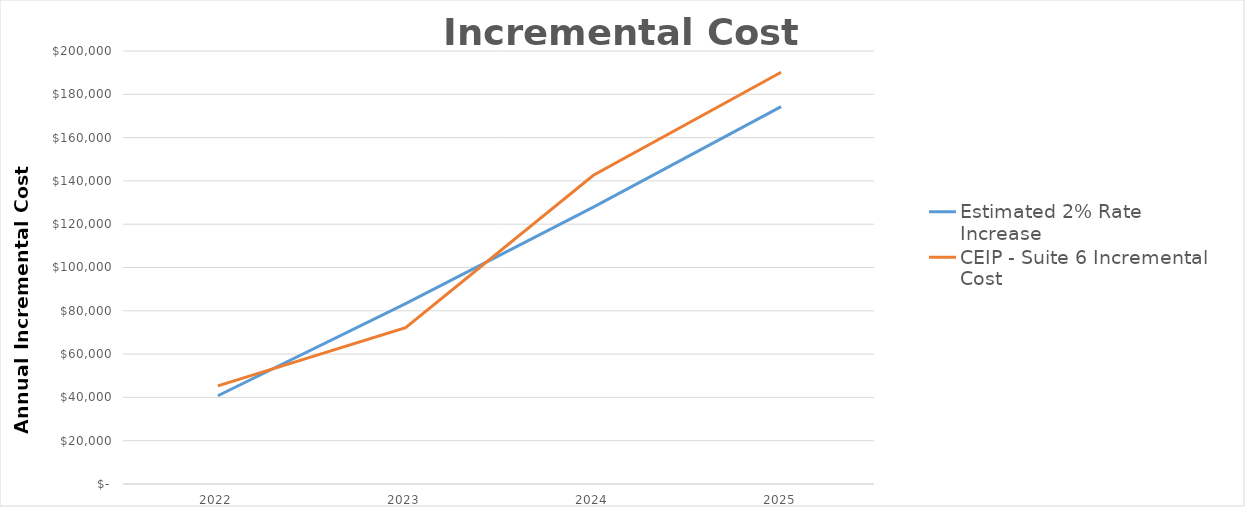
| Category | Estimated 2% Rate Increase | CEIP - Suite 6 Incremental Cost |
|---|---|---|
| 2022.0 | 40761 | 45316.501 |
| 2023.0 | 83356.246 | 72181.752 |
| 2024.0 | 127847.897 | 142610.947 |
| 2025.0 | 174299.994 | 190198.16 |